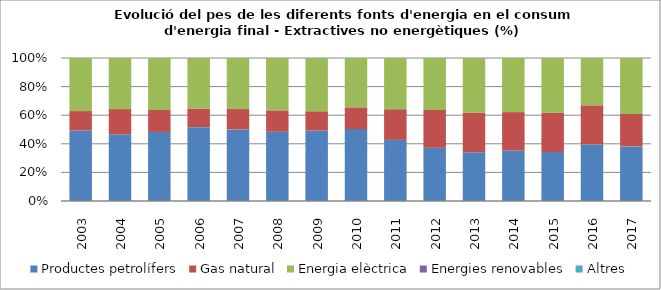
| Category | Productes petrolífers | Gas natural | Energia elèctrica | Energies renovables | Altres |
|---|---|---|---|---|---|
| 2003.0 | 33.5 | 9.2 | 25.2 | 0 | 0 |
| 2004.0 | 34.4 | 12.9 | 26.3 | 0 | 0 |
| 2005.0 | 33.8 | 10.8 | 25.4 | 0 | 0 |
| 2006.0 | 36.4 | 9.2 | 24.9 | 0 | 0 |
| 2007.0 | 34.5 | 9.8 | 24.6 | 0 | 0 |
| 2008.0 | 30.4 | 9.4 | 23 | 0 | 0 |
| 2009.0 | 24.3 | 6.7 | 18.4 | 0 | 0 |
| 2010.0 | 24.5 | 7.4 | 16.8 | 0 | 0 |
| 2011.0 | 22.3 | 11.2 | 18.7 | 0 | 0 |
| 2012.0 | 18.3 | 13 | 17.9 | 0 | 0 |
| 2013.0 | 16.1 | 13.1 | 18 | 0 | 0 |
| 2014.0 | 16.4 | 12.5 | 17.6 | 0 | 0 |
| 2015.0 | 16.4 | 13.2 | 18.3 | 0 | 0 |
| 2016.0 | 21.3 | 14.7 | 17.8 | 0 | 0 |
| 2017.0 | 25.2 | 15 | 25.8 | 0 | 0 |